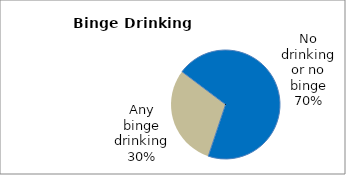
| Category | Series 0 |
|---|---|
| No drinking or no binge | 69.856 |
| Any binge drinking | 30.144 |